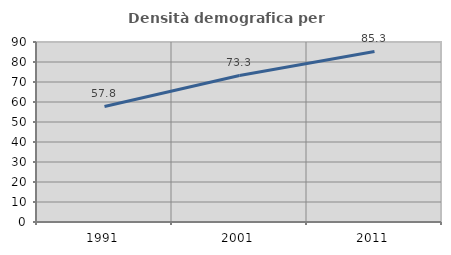
| Category | Densità demografica |
|---|---|
| 1991.0 | 57.768 |
| 2001.0 | 73.253 |
| 2011.0 | 85.29 |